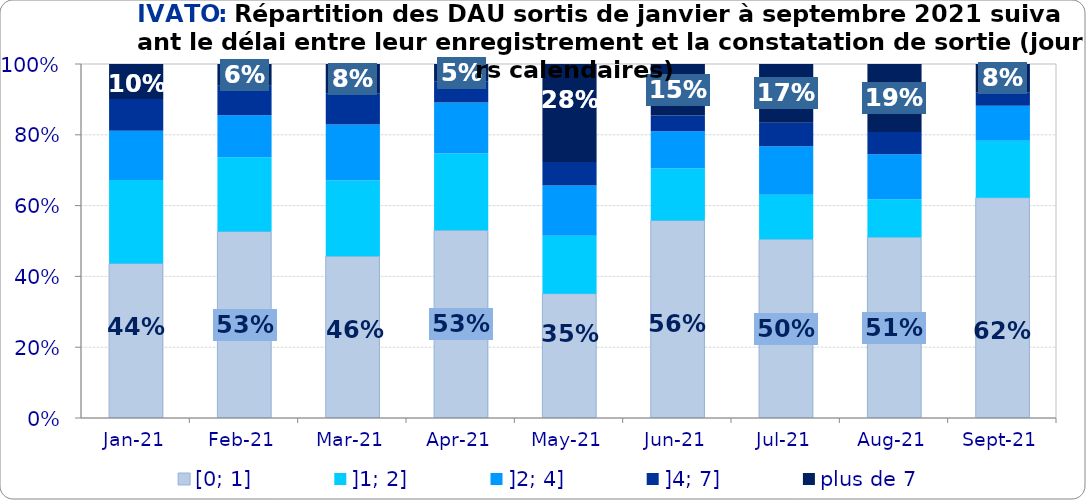
| Category | [0; 1] | ]1; 2] | ]2; 4] | ]4; 7] | plus de 7 |
|---|---|---|---|---|---|
| 2021-01-01 | 0.436 | 0.236 | 0.139 | 0.09 | 0.099 |
| 2021-02-01 | 0.527 | 0.21 | 0.119 | 0.083 | 0.061 |
| 2021-03-01 | 0.457 | 0.214 | 0.159 | 0.088 | 0.082 |
| 2021-04-01 | 0.53 | 0.217 | 0.144 | 0.06 | 0.048 |
| 2021-05-01 | 0.351 | 0.163 | 0.142 | 0.067 | 0.277 |
| 2021-06-01 | 0.558 | 0.148 | 0.104 | 0.045 | 0.145 |
| 2021-07-01 | 0.505 | 0.126 | 0.137 | 0.066 | 0.166 |
| 2021-08-01 | 0.511 | 0.107 | 0.127 | 0.062 | 0.192 |
| 2021-09-01 | 0.622 | 0.161 | 0.099 | 0.039 | 0.079 |